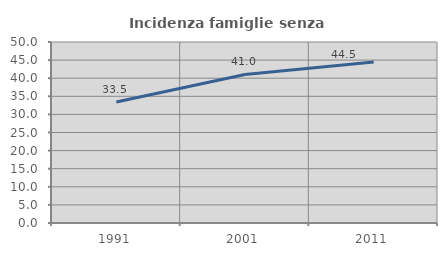
| Category | Incidenza famiglie senza nuclei |
|---|---|
| 1991.0 | 33.451 |
| 2001.0 | 41.026 |
| 2011.0 | 44.49 |